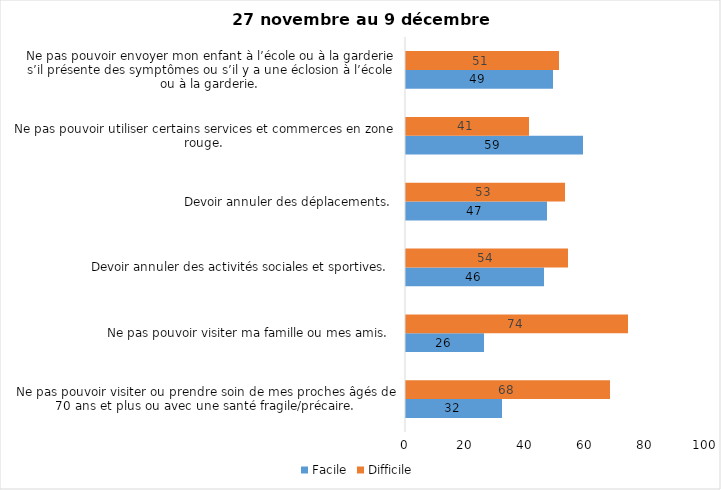
| Category | Facile | Difficile |
|---|---|---|
| Ne pas pouvoir visiter ou prendre soin de mes proches âgés de 70 ans et plus ou avec une santé fragile/précaire.  | 32 | 68 |
| Ne pas pouvoir visiter ma famille ou mes amis.  | 26 | 74 |
| Devoir annuler des activités sociales et sportives.  | 46 | 54 |
| Devoir annuler des déplacements.  | 47 | 53 |
| Ne pas pouvoir utiliser certains services et commerces en zone rouge.  | 59 | 41 |
| Ne pas pouvoir envoyer mon enfant à l’école ou à la garderie s’il présente des symptômes ou s’il y a une éclosion à l’école ou à la garderie.  | 49 | 51 |